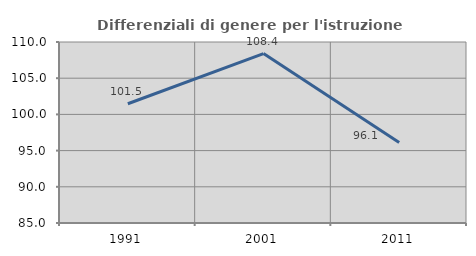
| Category | Differenziali di genere per l'istruzione superiore |
|---|---|
| 1991.0 | 101.471 |
| 2001.0 | 108.405 |
| 2011.0 | 96.117 |